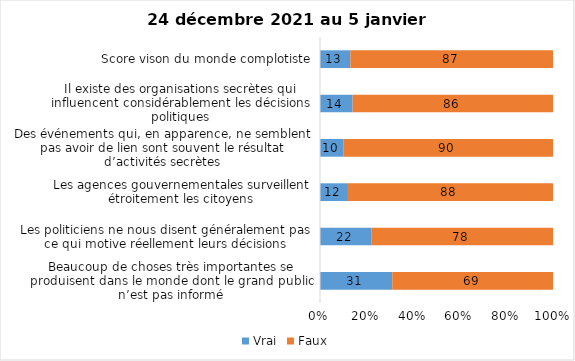
| Category | Vrai | Faux |
|---|---|---|
| Beaucoup de choses très importantes se produisent dans le monde dont le grand public n’est pas informé | 31 | 69 |
| Les politiciens ne nous disent généralement pas ce qui motive réellement leurs décisions | 22 | 78 |
| Les agences gouvernementales surveillent étroitement les citoyens | 12 | 88 |
| Des événements qui, en apparence, ne semblent pas avoir de lien sont souvent le résultat d’activités secrètes | 10 | 90 |
| Il existe des organisations secrètes qui influencent considérablement les décisions politiques | 14 | 86 |
| Score vison du monde complotiste | 13 | 87 |